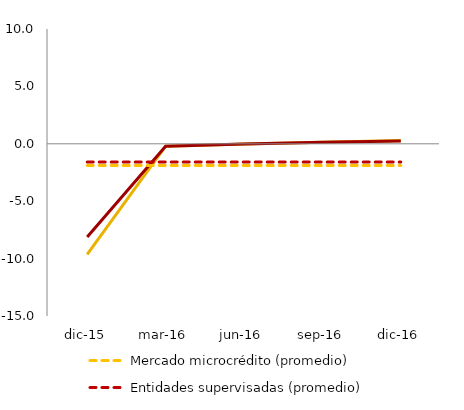
| Category | Mercado de microcrédito | Entidades supervisadas | Mercado microcrédito (promedio) | Entidades supervisadas (promedio) |
|---|---|---|---|---|
| dic-15 | -9.635 | -8.111 | -1.885 | -1.589 |
| mar-16 | -0.204 | -0.209 | -1.885 | -1.589 |
| jun-16 | -0.014 | -0.008 | -1.885 | -1.589 |
| sep-16 | 0.131 | 0.13 | -1.885 | -1.589 |
| dic-16 | 0.297 | 0.253 | -1.885 | -1.589 |